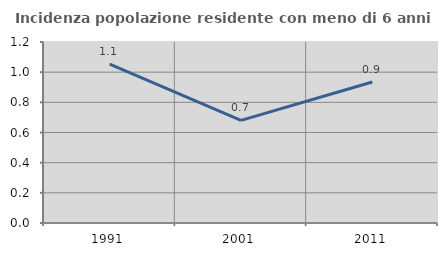
| Category | Incidenza popolazione residente con meno di 6 anni |
|---|---|
| 1991.0 | 1.053 |
| 2001.0 | 0.68 |
| 2011.0 | 0.935 |